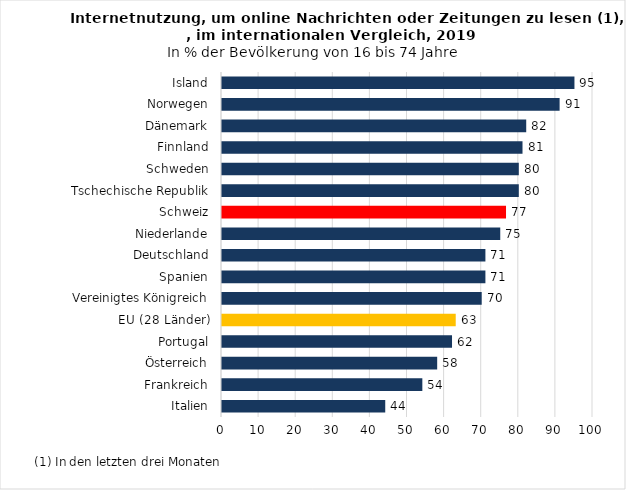
| Category | Series 0 |
|---|---|
| Italien | 44 |
| Frankreich | 54 |
| Österreich | 58 |
| Portugal | 62 |
| EU (28 Länder) | 63 |
| Vereinigtes Königreich | 70 |
| Spanien | 71 |
| Deutschland | 71 |
| Niederlande | 75 |
| Schweiz | 76.555 |
| Tschechische Republik | 80 |
| Schweden | 80 |
| Finnland | 81 |
| Dänemark | 82 |
| Norwegen | 91 |
| Island | 95 |